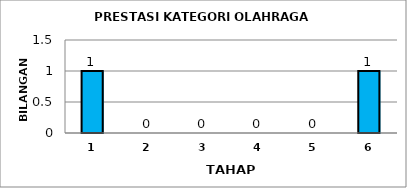
| Category | Series 0 |
|---|---|
| 1.0 | 1 |
| 2.0 | 0 |
| 3.0 | 0 |
| 4.0 | 0 |
| 5.0 | 0 |
| 6.0 | 1 |